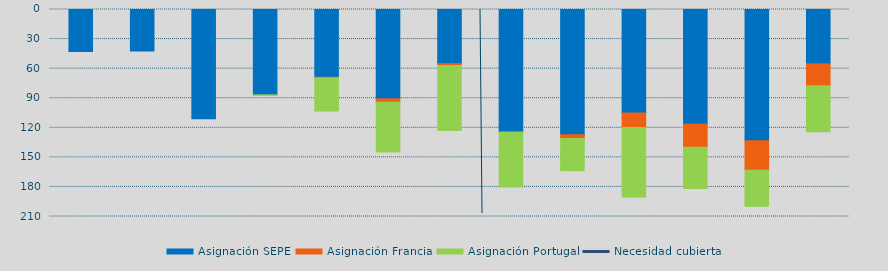
| Category | Asignación SEPE | Asignación Francia | Asignación Portugal |
|---|---|---|---|
| J | 42509 | 0 | 0 |
| J | 42214 | 0 | 0 |
| A | 110725 | 0 | 0 |
| S | 86576 | 0 | 437 |
| O | 68790.4 | 478.1 | 33750 |
| N | 90630.9 | 3513 | 50471 |
| D | 54862.4 | 1882.3 | 66113.3 |
| E | 124168 | 0 | 55888.5 |
| F | 127032.4 | 3833.9 | 32519.8 |
| M | 105026.4 | 14708.8 | 70500 |
| A | 116314.8 | 23425.3 | 41770 |
| M | 133153.9 | 29868.1 | 36645.5 |
| J | 55173.7 | 22114.9 | 46831.4 |